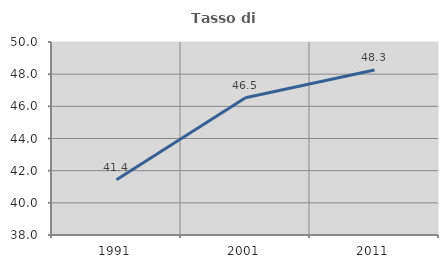
| Category | Tasso di occupazione   |
|---|---|
| 1991.0 | 41.433 |
| 2001.0 | 46.536 |
| 2011.0 | 48.262 |